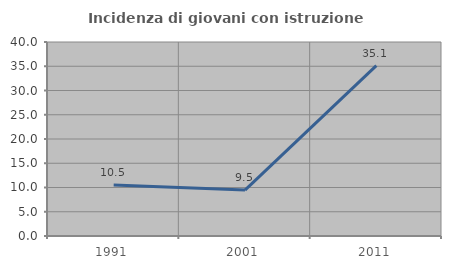
| Category | Incidenza di giovani con istruzione universitaria |
|---|---|
| 1991.0 | 10.526 |
| 2001.0 | 9.459 |
| 2011.0 | 35.135 |